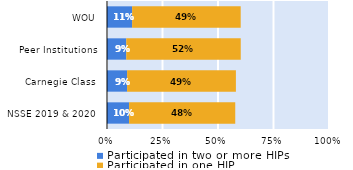
| Category | Participated in two or more HIPs | Participated in one HIP |
|---|---|---|
| NSSE 2019 & 2020 | 0.1 | 0.478 |
| Carnegie Class | 0.091 | 0.49 |
| Peer Institutions | 0.087 | 0.516 |
| WOU | 0.113 | 0.489 |